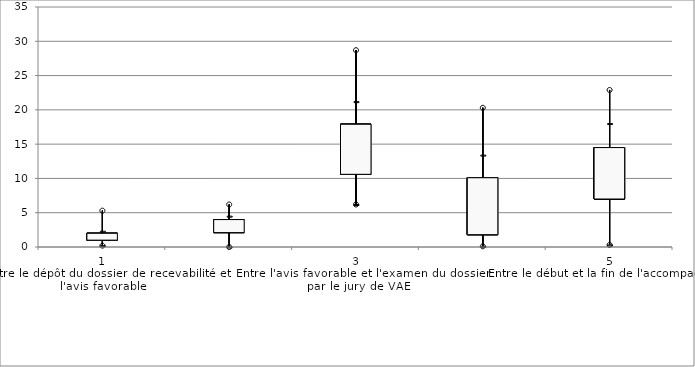
| Category | Series 0 | Series 1 | Series 2 | Series 3 | Series 4 | Series 5 | Series 6 | Series 7 |
|---|---|---|---|---|---|---|---|---|
| 1
Entre le dépôt du dossier de recevabilité et l'avis favorable | 1 | 0.2 | 0.2 | 1.5 | 1.6 | 2.3 | 5.3 | 2 |
| 2
Entre l'avis favorable et l'obtention d'un ou plusieurs financements | 2.1 | 0 | 0 | 3 | 3 | 4.5 | 6.2 | 4 |
| 3
Entre l'avis favorable et l'examen du dossier par le jury de VAE | 10.6 | 6.2 | 6.2 | 14 | 14.4 | 21.2 | 28.7 | 17.9 |
| 4
Si VAE partielle accordée : entre la décision du jury de VAE et l'obtention d'une VAE totale suite à des préconisations | 1.8 | 0.1 | 0.1 | 4.3 | 6.2 | 13.4 | 20.3 | 10.1 |
| 5
Entre le début et la fin de l'accompagnement | 7 | 0.3 | 0.3 | 10.7 | 10.9 | 18 | 22.9 | 14.5 |